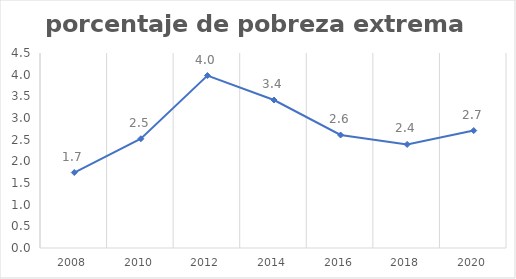
| Category | Series 0 |
|---|---|
| 2008.0 | 1.742 |
| 2010.0 | 2.521 |
| 2012.0 | 3.98 |
| 2014.0 | 3.415 |
| 2016.0 | 2.608 |
| 2018.0 | 2.391 |
| 2020.0 | 2.71 |